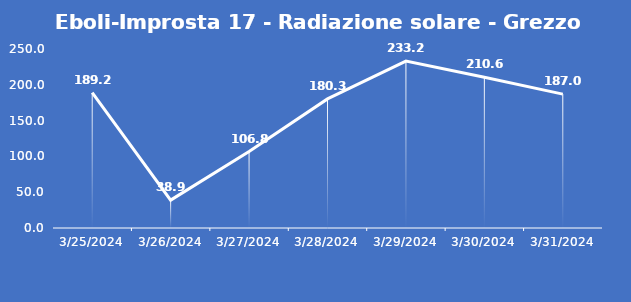
| Category | Eboli-Improsta 17 - Radiazione solare - Grezzo (W/m2) |
|---|---|
| 3/25/24 | 189.2 |
| 3/26/24 | 38.9 |
| 3/27/24 | 106.8 |
| 3/28/24 | 180.3 |
| 3/29/24 | 233.2 |
| 3/30/24 | 210.6 |
| 3/31/24 | 187 |